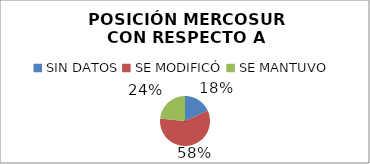
| Category | CANTIDAD DE POSICIONES |
|---|---|
| SIN DATOS | 547 |
| SE MODIFICÓ | 1752 |
| SE MANTUVO | 704 |